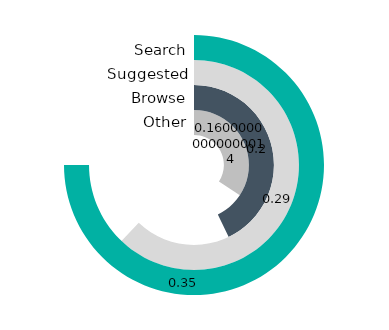
| Category | Series 0 | Series 1 | Series 2 | Series 3 |
|---|---|---|---|---|
| 0 | 0.343 | 0.429 | 0.621 | 0.75 |
| 1 | 0.657 | 0.571 | 0.379 | 0.25 |